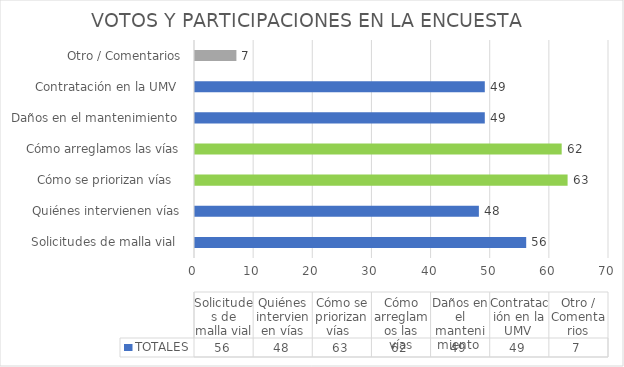
| Category | TOTALES  |
|---|---|
| Solicitudes de malla vial  | 56 |
| Quiénes intervienen vías | 48 |
| Cómo se priorizan vías   | 63 |
| Cómo arreglamos las vías | 62 |
| Daños en el mantenimiento  | 49 |
| Contratación en la UMV  | 49 |
| Otro / Comentarios | 7 |